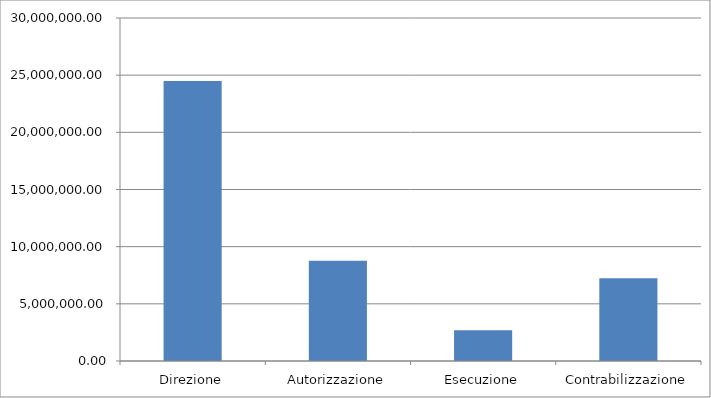
| Category | Series 0 |
|---|---|
| Direzione | 24488143.426 |
| Autorizzazione | 8767121.499 |
| Esecuzione | 2682680.854 |
| Contrabilizzazione | 7235597.141 |